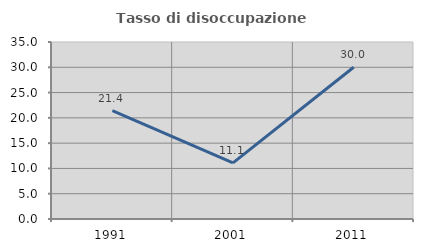
| Category | Tasso di disoccupazione giovanile  |
|---|---|
| 1991.0 | 21.429 |
| 2001.0 | 11.111 |
| 2011.0 | 30 |